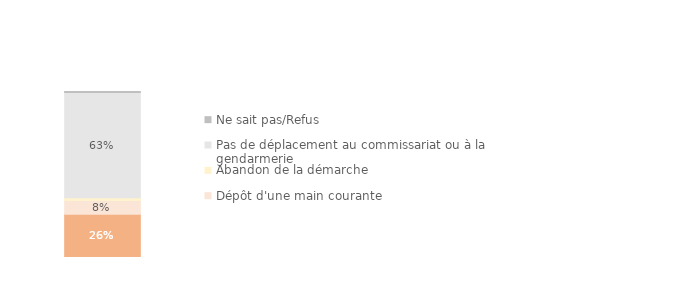
| Category | Dépôt de plainte | Dépôt d'une main courante | Abandon de la démarche | Pas de déplacement au commissariat ou à la gendarmerie | Ne sait pas/Refus |
|---|---|---|---|---|---|
| Ensemble des ménages victimes | 0.261 | 0.083 | 0.015 | 0.635 | 0.006 |